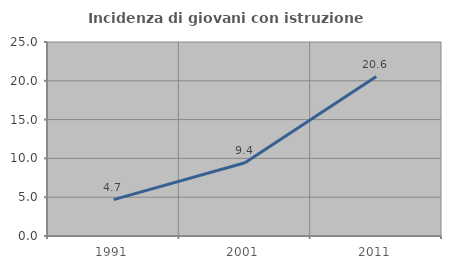
| Category | Incidenza di giovani con istruzione universitaria |
|---|---|
| 1991.0 | 4.688 |
| 2001.0 | 9.446 |
| 2011.0 | 20.553 |